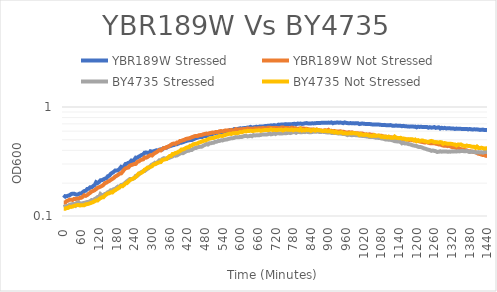
| Category | YBR189W Stressed | YBR189W Not Stressed | BY4735 Stressed | BY4735 Not Stressed |
|---|---|---|---|---|
| 0.0 | 0.147 | 0.132 | 0.12 | 0.117 |
| 5.0 | 0.152 | 0.133 | 0.122 | 0.116 |
| 10.0 | 0.152 | 0.137 | 0.123 | 0.119 |
| 15.0 | 0.154 | 0.138 | 0.123 | 0.119 |
| 20.0 | 0.155 | 0.141 | 0.127 | 0.122 |
| 25.0 | 0.159 | 0.141 | 0.128 | 0.121 |
| 30.0 | 0.16 | 0.14 | 0.129 | 0.122 |
| 35.0 | 0.16 | 0.143 | 0.129 | 0.124 |
| 40.0 | 0.158 | 0.143 | 0.125 | 0.125 |
| 45.0 | 0.157 | 0.145 | 0.132 | 0.126 |
| 50.0 | 0.159 | 0.144 | 0.134 | 0.126 |
| 54.99999999999999 | 0.161 | 0.147 | 0.131 | 0.125 |
| 60.0 | 0.161 | 0.147 | 0.13 | 0.126 |
| 65.0 | 0.165 | 0.15 | 0.131 | 0.125 |
| 70.0 | 0.169 | 0.155 | 0.132 | 0.126 |
| 75.0 | 0.171 | 0.153 | 0.133 | 0.128 |
| 80.0 | 0.177 | 0.156 | 0.135 | 0.129 |
| 85.00000000000001 | 0.178 | 0.16 | 0.135 | 0.13 |
| 90.0 | 0.183 | 0.163 | 0.137 | 0.131 |
| 95.0 | 0.183 | 0.168 | 0.14 | 0.133 |
| 99.99999999999999 | 0.188 | 0.17 | 0.139 | 0.134 |
| 105.0 | 0.192 | 0.173 | 0.143 | 0.136 |
| 110.00000000000001 | 0.204 | 0.176 | 0.145 | 0.139 |
| 114.99999999999999 | 0.2 | 0.181 | 0.149 | 0.139 |
| 120.0 | 0.205 | 0.184 | 0.148 | 0.143 |
| 125.00000000000001 | 0.213 | 0.186 | 0.159 | 0.146 |
| 130.0 | 0.213 | 0.189 | 0.155 | 0.148 |
| 135.0 | 0.217 | 0.193 | 0.155 | 0.149 |
| 140.0 | 0.22 | 0.2 | 0.159 | 0.154 |
| 144.99999999999997 | 0.222 | 0.202 | 0.16 | 0.158 |
| 150.0 | 0.232 | 0.207 | 0.165 | 0.161 |
| 155.0 | 0.234 | 0.21 | 0.167 | 0.162 |
| 160.0 | 0.244 | 0.215 | 0.172 | 0.165 |
| 165.0 | 0.249 | 0.218 | 0.172 | 0.164 |
| 170.00000000000003 | 0.254 | 0.223 | 0.176 | 0.17 |
| 175.0 | 0.262 | 0.23 | 0.177 | 0.172 |
| 180.0 | 0.261 | 0.234 | 0.182 | 0.176 |
| 185.00000000000003 | 0.263 | 0.239 | 0.186 | 0.179 |
| 190.0 | 0.271 | 0.245 | 0.185 | 0.184 |
| 195.0 | 0.282 | 0.246 | 0.192 | 0.188 |
| 200.0 | 0.276 | 0.255 | 0.194 | 0.188 |
| 205.0 | 0.286 | 0.266 | 0.197 | 0.193 |
| 210.0 | 0.3 | 0.273 | 0.203 | 0.199 |
| 215.0 | 0.302 | 0.276 | 0.208 | 0.2 |
| 219.99999999999997 | 0.308 | 0.278 | 0.213 | 0.207 |
| 225.0 | 0.311 | 0.29 | 0.218 | 0.214 |
| 230.00000000000003 | 0.323 | 0.294 | 0.218 | 0.217 |
| 235.0 | 0.319 | 0.296 | 0.219 | 0.22 |
| 240.0 | 0.329 | 0.3 | 0.223 | 0.224 |
| 244.99999999999997 | 0.343 | 0.301 | 0.234 | 0.228 |
| 250.00000000000003 | 0.342 | 0.314 | 0.234 | 0.236 |
| 255.0 | 0.35 | 0.316 | 0.24 | 0.246 |
| 260.0 | 0.357 | 0.324 | 0.249 | 0.246 |
| 265.0 | 0.363 | 0.329 | 0.254 | 0.25 |
| 270.0 | 0.366 | 0.331 | 0.258 | 0.256 |
| 275.0 | 0.381 | 0.345 | 0.259 | 0.266 |
| 280.0 | 0.382 | 0.343 | 0.266 | 0.27 |
| 285.0 | 0.38 | 0.348 | 0.271 | 0.278 |
| 289.99999999999994 | 0.374 | 0.356 | 0.279 | 0.278 |
| 295.00000000000006 | 0.393 | 0.362 | 0.287 | 0.282 |
| 300.0 | 0.39 | 0.359 | 0.296 | 0.286 |
| 305.0 | 0.392 | 0.37 | 0.3 | 0.296 |
| 310.0 | 0.396 | 0.378 | 0.308 | 0.298 |
| 315.0 | 0.401 | 0.384 | 0.304 | 0.304 |
| 320.0 | 0.399 | 0.393 | 0.314 | 0.307 |
| 325.0 | 0.406 | 0.402 | 0.324 | 0.311 |
| 330.0 | 0.409 | 0.399 | 0.318 | 0.313 |
| 334.99999999999994 | 0.407 | 0.411 | 0.333 | 0.326 |
| 340.00000000000006 | 0.42 | 0.42 | 0.339 | 0.328 |
| 345.0 | 0.421 | 0.42 | 0.337 | 0.331 |
| 350.0 | 0.423 | 0.43 | 0.338 | 0.333 |
| 355.0 | 0.433 | 0.433 | 0.339 | 0.345 |
| 360.0 | 0.436 | 0.44 | 0.343 | 0.355 |
| 365.0 | 0.44 | 0.451 | 0.348 | 0.355 |
| 370.00000000000006 | 0.446 | 0.459 | 0.352 | 0.371 |
| 375.0 | 0.448 | 0.462 | 0.362 | 0.371 |
| 380.0 | 0.456 | 0.46 | 0.357 | 0.379 |
| 385.0 | 0.456 | 0.473 | 0.36 | 0.38 |
| 390.0 | 0.462 | 0.473 | 0.367 | 0.389 |
| 394.99999999999994 | 0.47 | 0.488 | 0.373 | 0.394 |
| 400.0 | 0.47 | 0.489 | 0.378 | 0.407 |
| 405.0 | 0.475 | 0.496 | 0.377 | 0.408 |
| 410.0 | 0.482 | 0.499 | 0.383 | 0.413 |
| 415.00000000000006 | 0.486 | 0.509 | 0.39 | 0.421 |
| 420.0 | 0.491 | 0.512 | 0.396 | 0.426 |
| 425.0 | 0.495 | 0.515 | 0.396 | 0.427 |
| 430.0 | 0.497 | 0.52 | 0.403 | 0.442 |
| 435.0 | 0.497 | 0.528 | 0.403 | 0.442 |
| 439.99999999999994 | 0.504 | 0.533 | 0.413 | 0.454 |
| 445.0 | 0.513 | 0.54 | 0.419 | 0.458 |
| 450.0 | 0.519 | 0.543 | 0.421 | 0.46 |
| 455.0 | 0.523 | 0.542 | 0.427 | 0.464 |
| 460.00000000000006 | 0.529 | 0.55 | 0.43 | 0.472 |
| 465.0 | 0.531 | 0.553 | 0.431 | 0.476 |
| 470.0 | 0.529 | 0.555 | 0.433 | 0.482 |
| 475.0 | 0.54 | 0.562 | 0.443 | 0.489 |
| 480.0 | 0.542 | 0.567 | 0.449 | 0.493 |
| 485.00000000000006 | 0.542 | 0.57 | 0.457 | 0.497 |
| 489.99999999999994 | 0.55 | 0.568 | 0.452 | 0.504 |
| 495.0 | 0.56 | 0.575 | 0.465 | 0.514 |
| 500.00000000000006 | 0.558 | 0.578 | 0.465 | 0.515 |
| 504.99999999999994 | 0.564 | 0.583 | 0.468 | 0.52 |
| 510.0 | 0.571 | 0.581 | 0.47 | 0.521 |
| 515.0 | 0.576 | 0.588 | 0.48 | 0.528 |
| 520.0 | 0.582 | 0.591 | 0.48 | 0.532 |
| 525.0 | 0.577 | 0.589 | 0.488 | 0.533 |
| 530.0 | 0.585 | 0.6 | 0.489 | 0.545 |
| 534.9999999999999 | 0.586 | 0.602 | 0.495 | 0.544 |
| 540.0 | 0.589 | 0.599 | 0.494 | 0.542 |
| 545.0000000000001 | 0.591 | 0.603 | 0.5 | 0.551 |
| 550.0 | 0.603 | 0.61 | 0.502 | 0.554 |
| 555.0 | 0.602 | 0.609 | 0.504 | 0.56 |
| 560.0 | 0.601 | 0.612 | 0.51 | 0.565 |
| 565.0 | 0.614 | 0.606 | 0.513 | 0.568 |
| 570.0 | 0.609 | 0.615 | 0.517 | 0.565 |
| 575.0 | 0.614 | 0.608 | 0.517 | 0.573 |
| 579.9999999999999 | 0.628 | 0.61 | 0.521 | 0.573 |
| 585.0 | 0.626 | 0.626 | 0.529 | 0.578 |
| 590.0000000000001 | 0.627 | 0.621 | 0.528 | 0.574 |
| 595.0 | 0.632 | 0.623 | 0.527 | 0.58 |
| 600.0 | 0.637 | 0.624 | 0.532 | 0.589 |
| 605.0 | 0.636 | 0.626 | 0.53 | 0.586 |
| 610.0 | 0.638 | 0.627 | 0.537 | 0.594 |
| 615.0 | 0.642 | 0.629 | 0.543 | 0.6 |
| 620.0 | 0.643 | 0.628 | 0.543 | 0.597 |
| 624.9999999999999 | 0.647 | 0.636 | 0.537 | 0.604 |
| 630.0 | 0.647 | 0.633 | 0.54 | 0.602 |
| 635.0000000000001 | 0.657 | 0.631 | 0.545 | 0.606 |
| 640.0 | 0.649 | 0.632 | 0.539 | 0.603 |
| 645.0 | 0.651 | 0.626 | 0.552 | 0.603 |
| 650.0 | 0.654 | 0.638 | 0.548 | 0.607 |
| 655.0 | 0.66 | 0.634 | 0.55 | 0.608 |
| 660.0 | 0.654 | 0.637 | 0.55 | 0.609 |
| 665.0 | 0.661 | 0.637 | 0.551 | 0.612 |
| 669.9999999999999 | 0.664 | 0.638 | 0.555 | 0.604 |
| 675.0 | 0.662 | 0.64 | 0.56 | 0.61 |
| 680.0000000000001 | 0.664 | 0.64 | 0.56 | 0.612 |
| 685.0 | 0.67 | 0.639 | 0.56 | 0.616 |
| 690.0 | 0.668 | 0.638 | 0.559 | 0.616 |
| 695.0 | 0.674 | 0.646 | 0.563 | 0.613 |
| 700.0 | 0.673 | 0.646 | 0.572 | 0.618 |
| 705.0 | 0.678 | 0.641 | 0.561 | 0.624 |
| 710.0 | 0.675 | 0.64 | 0.566 | 0.614 |
| 714.9999999999999 | 0.682 | 0.641 | 0.575 | 0.618 |
| 720.0 | 0.678 | 0.644 | 0.565 | 0.616 |
| 725.0 | 0.676 | 0.642 | 0.573 | 0.613 |
| 730.0 | 0.689 | 0.64 | 0.575 | 0.619 |
| 735.0 | 0.684 | 0.639 | 0.57 | 0.617 |
| 740.0000000000001 | 0.692 | 0.648 | 0.571 | 0.62 |
| 744.9999999999999 | 0.691 | 0.65 | 0.573 | 0.609 |
| 750.0 | 0.692 | 0.643 | 0.576 | 0.617 |
| 755.0 | 0.696 | 0.642 | 0.575 | 0.623 |
| 760.0 | 0.692 | 0.64 | 0.577 | 0.619 |
| 765.0 | 0.696 | 0.64 | 0.584 | 0.618 |
| 770.0 | 0.693 | 0.639 | 0.576 | 0.616 |
| 775.0 | 0.694 | 0.647 | 0.582 | 0.622 |
| 780.0 | 0.699 | 0.642 | 0.588 | 0.611 |
| 785.0000000000001 | 0.702 | 0.639 | 0.589 | 0.619 |
| 789.9999999999999 | 0.692 | 0.636 | 0.58 | 0.619 |
| 795.0 | 0.704 | 0.629 | 0.591 | 0.617 |
| 800.0 | 0.703 | 0.634 | 0.59 | 0.612 |
| 805.0 | 0.704 | 0.638 | 0.586 | 0.629 |
| 810.0 | 0.699 | 0.636 | 0.587 | 0.608 |
| 815.0 | 0.703 | 0.636 | 0.592 | 0.615 |
| 820.0 | 0.708 | 0.63 | 0.588 | 0.61 |
| 825.0 | 0.712 | 0.632 | 0.593 | 0.622 |
| 830.0000000000001 | 0.707 | 0.627 | 0.589 | 0.614 |
| 834.9999999999999 | 0.707 | 0.622 | 0.587 | 0.617 |
| 840.0 | 0.707 | 0.622 | 0.586 | 0.603 |
| 845.0 | 0.708 | 0.62 | 0.59 | 0.612 |
| 850.0 | 0.707 | 0.621 | 0.592 | 0.619 |
| 855.0 | 0.709 | 0.615 | 0.594 | 0.606 |
| 860.0 | 0.713 | 0.622 | 0.594 | 0.618 |
| 865.0 | 0.712 | 0.613 | 0.595 | 0.612 |
| 870.0 | 0.713 | 0.61 | 0.589 | 0.611 |
| 875.0000000000001 | 0.716 | 0.609 | 0.59 | 0.607 |
| 879.9999999999999 | 0.717 | 0.602 | 0.593 | 0.601 |
| 885.0 | 0.718 | 0.61 | 0.59 | 0.602 |
| 890.0 | 0.717 | 0.612 | 0.588 | 0.607 |
| 895.0 | 0.717 | 0.607 | 0.585 | 0.6 |
| 900.0 | 0.719 | 0.616 | 0.583 | 0.598 |
| 905.0 | 0.716 | 0.598 | 0.586 | 0.604 |
| 910.0 | 0.722 | 0.605 | 0.579 | 0.592 |
| 915.0 | 0.71 | 0.598 | 0.578 | 0.596 |
| 920.0000000000001 | 0.717 | 0.603 | 0.577 | 0.584 |
| 924.9999999999999 | 0.717 | 0.594 | 0.577 | 0.594 |
| 930.0 | 0.722 | 0.595 | 0.575 | 0.581 |
| 935.0 | 0.717 | 0.596 | 0.57 | 0.581 |
| 940.0 | 0.72 | 0.599 | 0.571 | 0.584 |
| 945.0 | 0.717 | 0.594 | 0.569 | 0.587 |
| 950.0 | 0.711 | 0.594 | 0.565 | 0.573 |
| 955.0 | 0.722 | 0.588 | 0.565 | 0.576 |
| 960.0 | 0.716 | 0.584 | 0.56 | 0.573 |
| 964.9999999999999 | 0.711 | 0.583 | 0.552 | 0.571 |
| 970.0000000000001 | 0.709 | 0.587 | 0.561 | 0.573 |
| 975.0 | 0.712 | 0.583 | 0.554 | 0.576 |
| 979.9999999999999 | 0.708 | 0.586 | 0.551 | 0.573 |
| 985.0 | 0.709 | 0.576 | 0.554 | 0.578 |
| 990.0 | 0.707 | 0.577 | 0.554 | 0.573 |
| 995.0 | 0.71 | 0.574 | 0.55 | 0.571 |
| 1000.0000000000001 | 0.711 | 0.573 | 0.549 | 0.569 |
| 1005.0 | 0.698 | 0.572 | 0.546 | 0.553 |
| 1009.9999999999999 | 0.702 | 0.571 | 0.546 | 0.566 |
| 1015.0000000000001 | 0.706 | 0.572 | 0.542 | 0.556 |
| 1020.0 | 0.702 | 0.565 | 0.543 | 0.553 |
| 1024.9999999999998 | 0.699 | 0.56 | 0.539 | 0.558 |
| 1030.0 | 0.697 | 0.561 | 0.537 | 0.556 |
| 1035.0 | 0.697 | 0.559 | 0.534 | 0.551 |
| 1040.0 | 0.698 | 0.563 | 0.53 | 0.543 |
| 1045.0000000000002 | 0.695 | 0.554 | 0.531 | 0.543 |
| 1050.0 | 0.691 | 0.556 | 0.53 | 0.542 |
| 1055.0 | 0.691 | 0.554 | 0.528 | 0.553 |
| 1060.0 | 0.691 | 0.547 | 0.523 | 0.542 |
| 1065.0 | 0.692 | 0.541 | 0.523 | 0.545 |
| 1069.9999999999998 | 0.691 | 0.544 | 0.52 | 0.548 |
| 1075.0 | 0.687 | 0.545 | 0.521 | 0.542 |
| 1080.0 | 0.685 | 0.546 | 0.515 | 0.531 |
| 1085.0 | 0.683 | 0.538 | 0.512 | 0.537 |
| 1090.0000000000002 | 0.685 | 0.536 | 0.508 | 0.526 |
| 1095.0 | 0.682 | 0.533 | 0.502 | 0.534 |
| 1100.0 | 0.68 | 0.531 | 0.504 | 0.525 |
| 1105.0 | 0.679 | 0.531 | 0.5 | 0.535 |
| 1110.0 | 0.683 | 0.528 | 0.501 | 0.523 |
| 1114.9999999999998 | 0.677 | 0.526 | 0.497 | 0.523 |
| 1120.0 | 0.672 | 0.525 | 0.492 | 0.521 |
| 1125.0 | 0.673 | 0.524 | 0.486 | 0.536 |
| 1130.0 | 0.677 | 0.521 | 0.485 | 0.523 |
| 1135.0000000000002 | 0.672 | 0.514 | 0.483 | 0.52 |
| 1140.0 | 0.674 | 0.514 | 0.481 | 0.517 |
| 1145.0 | 0.672 | 0.515 | 0.48 | 0.522 |
| 1150.0 | 0.666 | 0.506 | 0.465 | 0.512 |
| 1155.0 | 0.671 | 0.506 | 0.472 | 0.514 |
| 1159.9999999999998 | 0.666 | 0.507 | 0.463 | 0.511 |
| 1165.0 | 0.666 | 0.504 | 0.465 | 0.502 |
| 1170.0 | 0.661 | 0.503 | 0.458 | 0.505 |
| 1175.0 | 0.66 | 0.498 | 0.455 | 0.506 |
| 1180.0000000000002 | 0.662 | 0.501 | 0.453 | 0.506 |
| 1185.0 | 0.664 | 0.497 | 0.446 | 0.506 |
| 1190.0 | 0.66 | 0.494 | 0.443 | 0.495 |
| 1195.0 | 0.661 | 0.491 | 0.441 | 0.502 |
| 1200.0 | 0.651 | 0.489 | 0.438 | 0.486 |
| 1204.9999999999998 | 0.661 | 0.489 | 0.431 | 0.495 |
| 1210.0 | 0.656 | 0.483 | 0.43 | 0.488 |
| 1215.0 | 0.659 | 0.48 | 0.428 | 0.492 |
| 1220.0 | 0.654 | 0.477 | 0.423 | 0.493 |
| 1225.0000000000002 | 0.655 | 0.474 | 0.417 | 0.487 |
| 1230.0 | 0.656 | 0.473 | 0.414 | 0.485 |
| 1235.0 | 0.656 | 0.476 | 0.409 | 0.479 |
| 1240.0 | 0.646 | 0.469 | 0.405 | 0.477 |
| 1245.0 | 0.653 | 0.466 | 0.403 | 0.484 |
| 1249.9999999999998 | 0.646 | 0.464 | 0.396 | 0.488 |
| 1255.0 | 0.649 | 0.464 | 0.399 | 0.484 |
| 1260.0 | 0.654 | 0.465 | 0.396 | 0.475 |
| 1265.0 | 0.643 | 0.46 | 0.393 | 0.477 |
| 1270.0000000000002 | 0.647 | 0.458 | 0.387 | 0.475 |
| 1275.0 | 0.651 | 0.454 | 0.388 | 0.472 |
| 1280.0 | 0.635 | 0.454 | 0.393 | 0.476 |
| 1285.0 | 0.645 | 0.447 | 0.389 | 0.473 |
| 1290.0 | 0.638 | 0.443 | 0.39 | 0.459 |
| 1294.9999999999998 | 0.644 | 0.44 | 0.391 | 0.467 |
| 1300.0 | 0.636 | 0.443 | 0.391 | 0.463 |
| 1305.0 | 0.637 | 0.438 | 0.389 | 0.46 |
| 1310.0 | 0.64 | 0.441 | 0.39 | 0.461 |
| 1315.0000000000002 | 0.636 | 0.435 | 0.389 | 0.46 |
| 1320.0 | 0.637 | 0.429 | 0.391 | 0.459 |
| 1325.0 | 0.635 | 0.427 | 0.39 | 0.454 |
| 1330.0 | 0.629 | 0.426 | 0.392 | 0.452 |
| 1335.0 | 0.634 | 0.421 | 0.391 | 0.443 |
| 1339.9999999999998 | 0.631 | 0.424 | 0.392 | 0.452 |
| 1345.0 | 0.631 | 0.416 | 0.392 | 0.451 |
| 1350.0 | 0.63 | 0.41 | 0.394 | 0.454 |
| 1355.0 | 0.628 | 0.408 | 0.396 | 0.446 |
| 1360.0000000000002 | 0.629 | 0.408 | 0.393 | 0.441 |
| 1365.0 | 0.628 | 0.402 | 0.392 | 0.437 |
| 1370.0 | 0.629 | 0.4 | 0.394 | 0.443 |
| 1375.0 | 0.623 | 0.393 | 0.391 | 0.439 |
| 1380.0 | 0.629 | 0.392 | 0.386 | 0.439 |
| 1384.9999999999998 | 0.624 | 0.392 | 0.389 | 0.434 |
| 1390.0 | 0.622 | 0.389 | 0.388 | 0.431 |
| 1395.0 | 0.624 | 0.386 | 0.388 | 0.432 |
| 1400.0 | 0.623 | 0.385 | 0.384 | 0.422 |
| 1405.0000000000002 | 0.623 | 0.378 | 0.382 | 0.434 |
| 1410.0 | 0.621 | 0.372 | 0.385 | 0.421 |
| 1415.0 | 0.616 | 0.371 | 0.383 | 0.419 |
| 1420.0 | 0.617 | 0.366 | 0.384 | 0.423 |
| 1425.0 | 0.621 | 0.362 | 0.381 | 0.419 |
| 1429.9999999999998 | 0.615 | 0.363 | 0.387 | 0.417 |
| 1435.0 | 0.616 | 0.357 | 0.386 | 0.417 |
| 1440.0 | 0.612 | 0.356 | 0.386 | 0.419 |